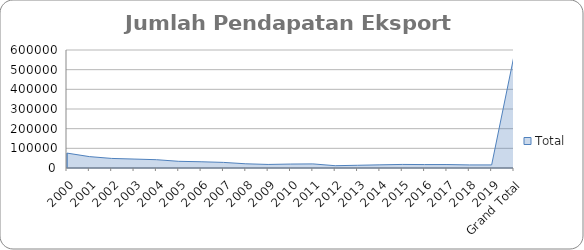
| Category | Total |
|---|---|
| 2000 | 75766 |
| 2001 | 57963 |
| 2002 | 48631 |
| 2003 | 45493 |
| 2004 | 42208 |
| 2005 | 33994 |
| 2006 | 31740 |
| 2007 | 28459 |
| 2008 | 21411 |
| 2009 | 18047 |
| 2010 | 20083 |
| 2011 | 20848 |
| 2012 | 11748 |
| 2013 | 13826 |
| 2014 | 16102 |
| 2015 | 18122 |
| 2016 | 17421 |
| 2017 | 17563 |
| 2018 | 15661 |
| 2019 | 15661 |
| Grand Total | 570747 |